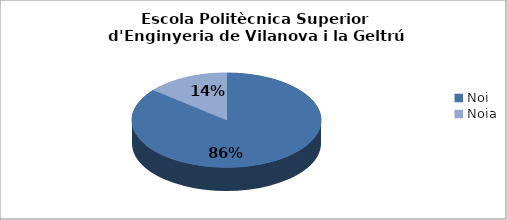
| Category | Escola Politècnica Superior d'Enginyeria de Vilanova i la Geltrú (EPSEVG) - Gènere |
|---|---|
| Noi | 0.859 |
| Noia | 0.141 |